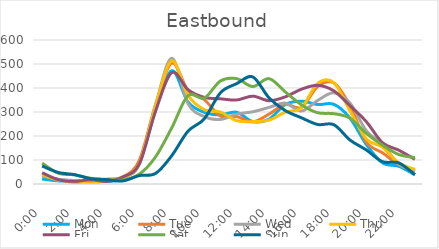
| Category | Mon | Tue | Wed | Thu | Fri | Sat | Sun |
|---|---|---|---|---|---|---|---|
| 0.0 | 21 | 35 | 33 | 41 | 47 | 87 | 75 |
| 0.041667 | 13 | 19 | 20 | 16 | 18 | 45 | 48 |
| 0.083333 | 13 | 6 | 14 | 12 | 11 | 38 | 39 |
| 0.125 | 10 | 10 | 6 | 3 | 18 | 24 | 22 |
| 0.166667 | 11 | 20 | 14 | 17 | 11 | 19 | 18 |
| 0.208333 | 22 | 30 | 28 | 28 | 30 | 17 | 13 |
| 0.25 | 92 | 99 | 82 | 86 | 84 | 41 | 35 |
| 0.291667 | 306 | 331 | 328 | 325 | 304 | 113 | 44 |
| 0.333333 | 472 | 504 | 524 | 513 | 464 | 234 | 118 |
| 0.375 | 342 | 390 | 335 | 370 | 393 | 368 | 220 |
| 0.416667 | 299 | 352 | 281 | 310 | 361 | 358 | 271 |
| 0.458333 | 288 | 283 | 269 | 300 | 355 | 429 | 380 |
| 0.5 | 299 | 281 | 291 | 264 | 350 | 439 | 418 |
| 0.541667 | 260 | 259 | 301 | 260 | 366 | 406 | 446 |
| 0.5833333333333334 | 270 | 291 | 319 | 266 | 347 | 439 | 359 |
| 0.625 | 331 | 332 | 337 | 299 | 363 | 384 | 306 |
| 0.666667 | 345 | 319 | 304 | 318 | 395 | 330 | 276 |
| 0.708333 | 331 | 406 | 348 | 419 | 411 | 297 | 248 |
| 0.75 | 332 | 421 | 380 | 422 | 388 | 293 | 247 |
| 0.791667 | 274 | 326 | 337 | 304 | 326 | 274 | 183 |
| 0.833333 | 165 | 175 | 222 | 188 | 260 | 211 | 142 |
| 0.875 | 88 | 130 | 165 | 153 | 172 | 162 | 93 |
| 0.916667 | 74 | 81 | 83 | 88 | 141 | 123 | 88 |
| 0.958333 | 38 | 53 | 55 | 61 | 103 | 110 | 39 |